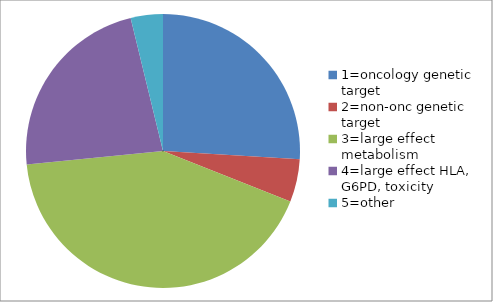
| Category | Series 0 |
|---|---|
| 1=oncology genetic target | 0.259 |
| 2=non-onc genetic target | 0.051 |
| 3=large effect metabolism | 0.424 |
| 4=large effect HLA, G6PD, toxicity | 0.228 |
| 5=other | 0.038 |